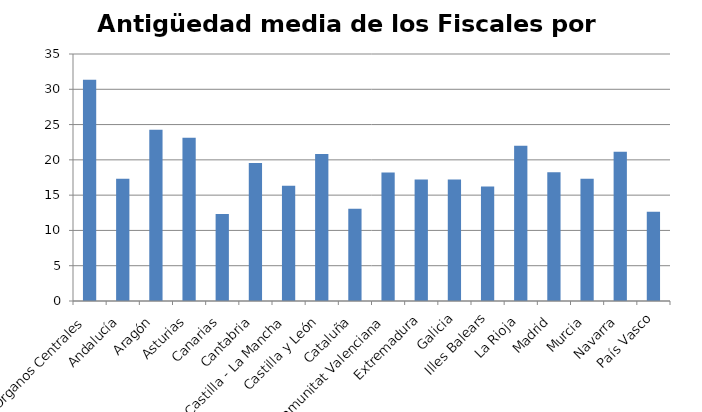
| Category | Series 0 |
|---|---|
| Órganos Centrales | 31.35 |
| Andalucía | 17.31 |
| Aragón | 24.25 |
| Asturias | 23.13 |
| Canarias | 12.34 |
| Cantabria | 19.56 |
| Castilla - La Mancha | 16.34 |
| Castilla y León | 20.82 |
| Cataluña | 13.06 |
| Comunitat Valenciana | 18.2 |
| Extremadura | 17.21 |
| Galicia | 17.23 |
| Illes Balears | 16.22 |
| La Rioja | 22 |
| Madrid | 18.26 |
| Murcia | 17.32 |
| Navarra | 21.14 |
| País Vasco | 12.65 |